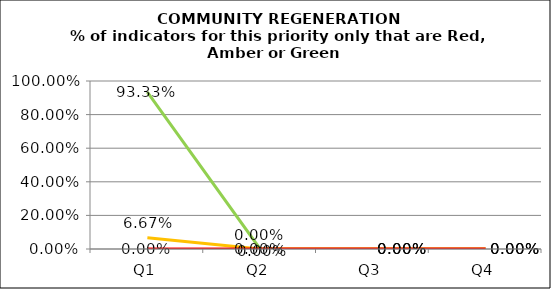
| Category | Green | Amber | Red |
|---|---|---|---|
| Q1 | 0.933 | 0.067 | 0 |
| Q2 | 0 | 0 | 0 |
| Q3 | 0 | 0 | 0 |
| Q4 | 0 | 0 | 0 |